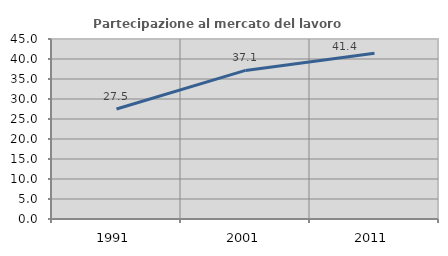
| Category | Partecipazione al mercato del lavoro  femminile |
|---|---|
| 1991.0 | 27.509 |
| 2001.0 | 37.143 |
| 2011.0 | 41.438 |